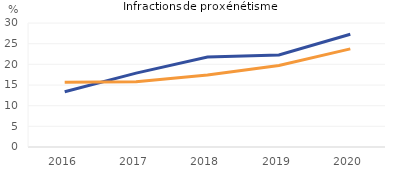
| Category | Affaires poursuivies pour une infraction avec au moins une victime mineure | Auteurs pousuivis pour une infraction avec  au moins une victime mineure |
|---|---|---|
| 2016.0 | 13.354 | 15.648 |
| 2017.0 | 17.868 | 15.8 |
| 2018.0 | 21.785 | 17.442 |
| 2019.0 | 22.275 | 19.723 |
| 2020.0 | 27.273 | 23.734 |